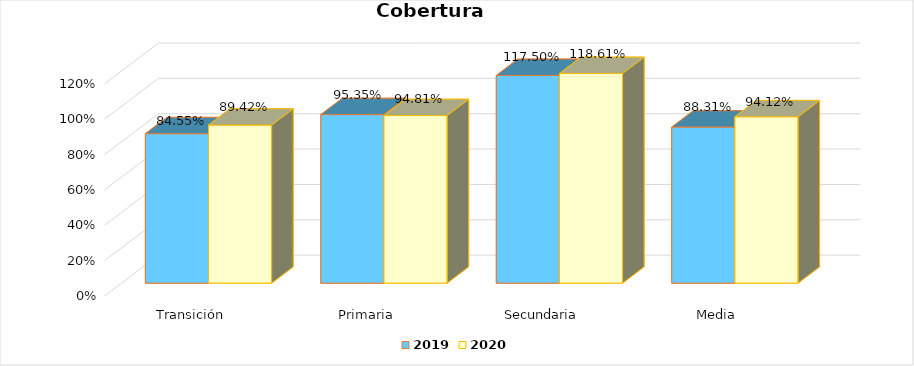
| Category | 2019 | 2020 |
|---|---|---|
| Transición | 0.846 | 0.894 |
| Primaria | 0.953 | 0.948 |
| Secundaria | 1.175 | 1.186 |
| Media | 0.883 | 0.941 |